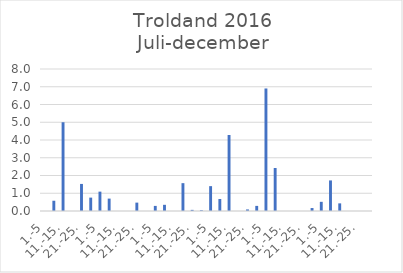
| Category | Series 0 |
|---|---|
| 1.-5 | 0 |
| 6.-10. | 0.578 |
| 11.-15. | 5 |
| 16.-20. | 0 |
| 21.-25. | 1.525 |
| 26.-31. | 0.754 |
| 1.-5 | 1.091 |
| 6.-10. | 0.699 |
| 11.-15. | 0 |
| 16.-20. | 0 |
| 21.-25. | 0.472 |
| 26.-31. | 0 |
| 1.-5 | 0.287 |
| 6.-10. | 0.348 |
| 11.-15. | 0 |
| 16.-20. | 1.569 |
| 21.-25. | 0.064 |
| 26.-30. | 0.043 |
| 1.-5 | 1.401 |
| 6.-10. | 0.675 |
| 11.-15. | 4.282 |
| 16.-20. | 0 |
| 21.-25. | 0.089 |
| 26.-31. | 0.288 |
| 1.-5 | 6.903 |
| 6.-10. | 2.421 |
| 11.-15. | 0 |
| 16.-20. | 0 |
| 21.-25. | 0 |
| 26.-30. | 0.167 |
| 1.-5 | 0.517 |
| 6.-10. | 1.722 |
| 11.-15. | 0.43 |
| 16.-20. | 0 |
| 21.-25. | 0 |
| 26.-31. | 0 |